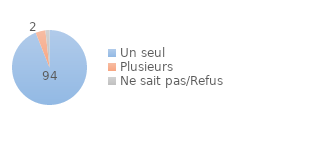
| Category | Series 0 |
|---|---|
| Un seul | 94 |
| Plusieurs  | 4.24 |
| Ne sait pas/Refus | 1.76 |